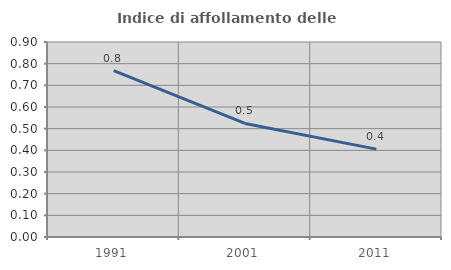
| Category | Indice di affollamento delle abitazioni  |
|---|---|
| 1991.0 | 0.768 |
| 2001.0 | 0.524 |
| 2011.0 | 0.405 |